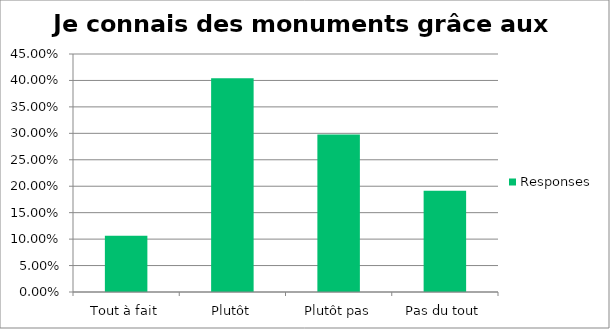
| Category | Responses |
|---|---|
| Tout à fait | 0.106 |
| Plutôt | 0.404 |
| Plutôt pas | 0.298 |
| Pas du tout | 0.192 |